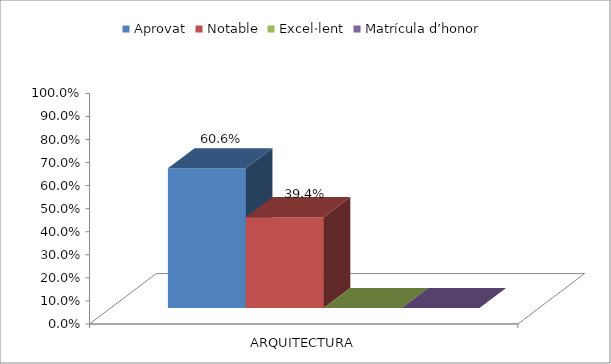
| Category | Aprovat | Notable | Excel·lent | Matrícula d’honor |
|---|---|---|---|---|
| ARQUITECTURA | 0.606 | 0.394 | 0 | 0 |